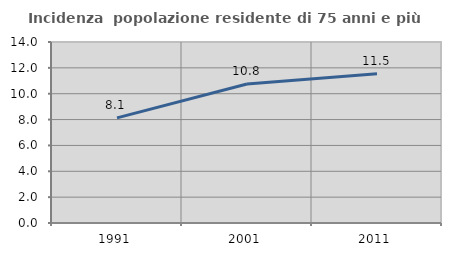
| Category | Incidenza  popolazione residente di 75 anni e più |
|---|---|
| 1991.0 | 8.131 |
| 2001.0 | 10.757 |
| 2011.0 | 11.538 |